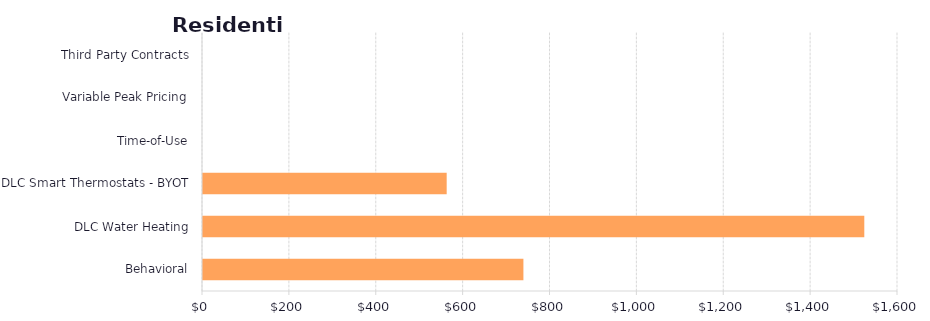
| Category | Series 1 |
|---|---|
| Behavioral | 737.63 |
| DLC Water Heating | 1522.414 |
| DLC Smart Thermostats - BYOT | 560.999 |
| Time-of-Use | 0 |
| Variable Peak Pricing | 0 |
| Third Party Contracts | 0 |